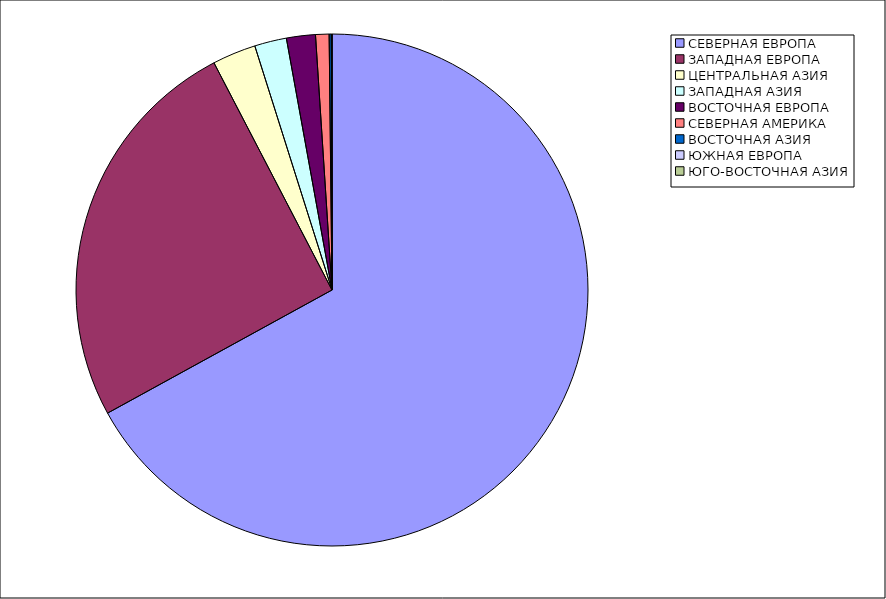
| Category | Оборот |
|---|---|
| СЕВЕРНАЯ ЕВРОПА | 67.013 |
| ЗАПАДНАЯ ЕВРОПА | 25.36 |
| ЦЕНТРАЛЬНАЯ АЗИЯ | 2.751 |
| ЗАПАДНАЯ АЗИЯ | 2.021 |
| ВОСТОЧНАЯ ЕВРОПА | 1.826 |
| СЕВЕРНАЯ АМЕРИКА | 0.85 |
| ВОСТОЧНАЯ АЗИЯ | 0.132 |
| ЮЖНАЯ ЕВРОПА | 0.046 |
| ЮГО-ВОСТОЧНАЯ АЗИЯ | 0.001 |